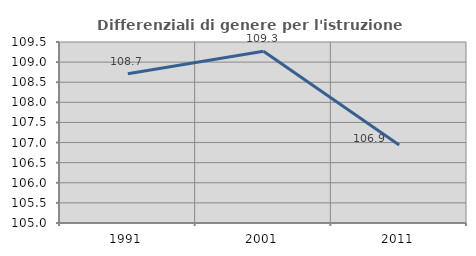
| Category | Differenziali di genere per l'istruzione superiore |
|---|---|
| 1991.0 | 108.709 |
| 2001.0 | 109.272 |
| 2011.0 | 106.938 |